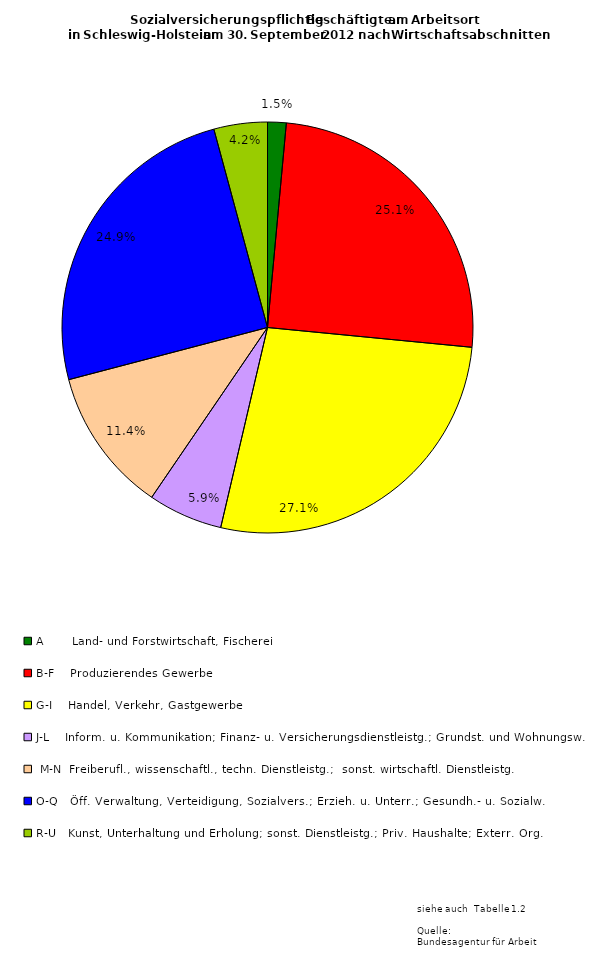
| Category | Series 0 | Series 1 | Series 2 |
|---|---|---|---|
| A       Land- und Forstwirtschaft, Fischerei | 12803 | 3462 | 9341 |
| B-F    Produzierendes Gewerbe | 219118 | 50330 | 168788 |
| G-I    Handel, Verkehr, Gastgewerbe | 237020 | 107095 | 129925 |
| J-L    Inform. u. Kommunikation; Finanz- u. Versicherungsdienstleistg.; Grundst. und Wohnungsw. | 51272 | 25047 | 26225 |
|  M-N  Freiberufl., wissenschaftl., techn. Dienstleistg.;  sonst. wirtschaftl. Dienstleistg.  | 99531 | 47711 | 51820 |
| O-Q   Öff. Verwaltung, Verteidigung, Sozialvers.; Erzieh. u. Unterr.; Gesundh.- u. Sozialw. | 217440 | 157332 | 60108 |
| R-U   Kunst, Unterhaltung und Erholung; sonst. Dienstleistg.; Priv. Haushalte; Exterr. Org. | 36749 | 25191 | 11558 |